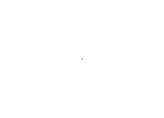
| Category | Series 0 |
|---|---|
| Available | 3660.4 |
| Picked | 0 |